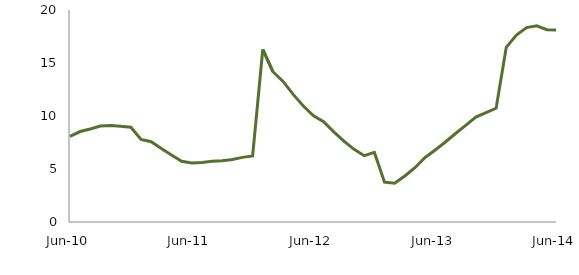
| Category | Series 0 |
|---|---|
| Jun-10 | 8.079 |
|  | 8.534 |
|  | 8.77 |
|  | 9.053 |
|  | 9.109 |
|  | 9.032 |
|  | 8.944 |
|  | 7.796 |
|  | 7.572 |
|  | 6.945 |
|  | 6.327 |
|  | 5.732 |
| Jun-11 | 5.566 |
|  | 5.619 |
|  | 5.739 |
|  | 5.777 |
|  | 5.893 |
|  | 6.097 |
|  | 6.236 |
|  | 16.275 |
|  | 14.177 |
|  | 13.262 |
|  | 12.037 |
|  | 10.94 |
| Jun-12 | 10.022 |
|  | 9.459 |
|  | 8.507 |
|  | 7.627 |
|  | 6.858 |
|  | 6.256 |
|  | 6.564 |
|  | 3.761 |
|  | 3.651 |
|  | 4.343 |
|  | 5.123 |
|  | 6.09 |
| Jun-13 | 6.793 |
|  | 7.549 |
|  | 8.351 |
|  | 9.122 |
|  | 9.9 |
|  | 10.325 |
|  | 10.727 |
|  | 16.476 |
|  | 17.627 |
|  | 18.342 |
|  | 18.502 |
|  | 18.146 |
| Jun-14 | 18.121 |